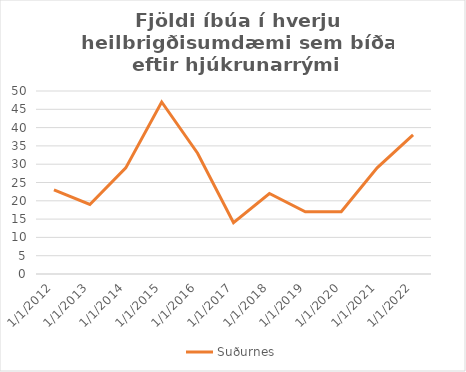
| Category | Suðurnes |
|---|---|
| 1/1/12 | 23 |
| 1/1/13 | 19 |
| 1/1/14 | 29 |
| 1/1/15 | 47 |
| 1/1/16 | 33 |
| 1/1/17 | 14 |
| 1/1/18 | 22 |
| 1/1/19 | 17 |
| 1/1/20 | 17 |
| 1/1/21 | 29 |
| 1/1/22 | 38 |